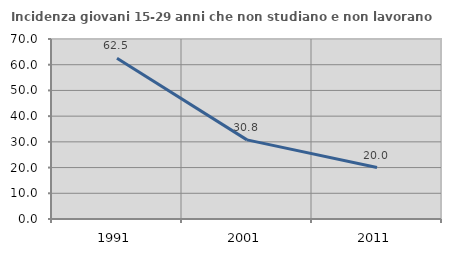
| Category | Incidenza giovani 15-29 anni che non studiano e non lavorano  |
|---|---|
| 1991.0 | 62.524 |
| 2001.0 | 30.769 |
| 2011.0 | 20 |